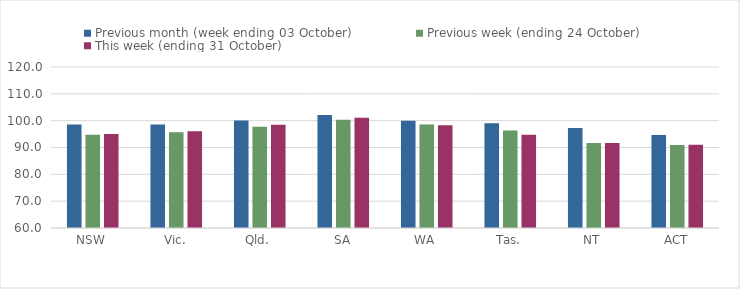
| Category | Previous month (week ending 03 October) | Previous week (ending 24 October) | This week (ending 31 October) |
|---|---|---|---|
| NSW | 98.53 | 94.79 | 95.01 |
| Vic. | 98.57 | 95.68 | 96.01 |
| Qld. | 100.05 | 97.73 | 98.5 |
| SA | 102.07 | 100.34 | 101.1 |
| WA | 99.97 | 98.6 | 98.33 |
| Tas. | 99 | 96.33 | 94.73 |
| NT | 97.23 | 91.64 | 91.65 |
| ACT | 94.68 | 90.93 | 91.01 |